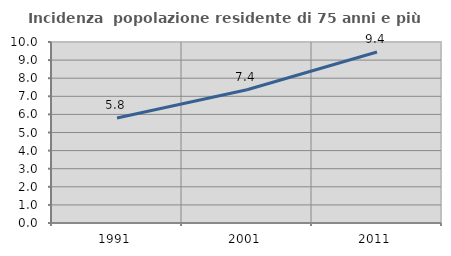
| Category | Incidenza  popolazione residente di 75 anni e più |
|---|---|
| 1991.0 | 5.805 |
| 2001.0 | 7.362 |
| 2011.0 | 9.449 |